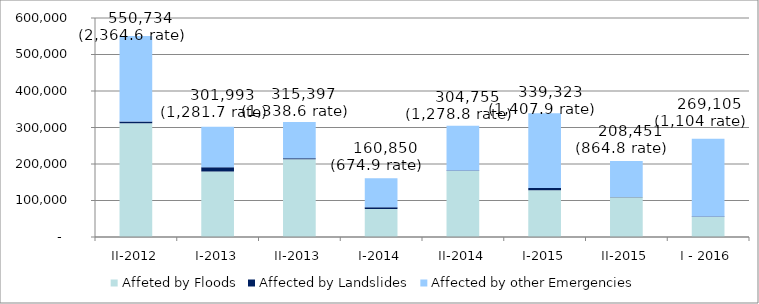
| Category | Affeted by Floods | Affected by Landslides | Affected by other Emergencies  |
|---|---|---|---|
| II-2012 | 311337 | 5039 | 234358 |
| I-2013 | 179302 | 11819 | 110872 |
| II-2013 | 212849 | 2866 | 99682 |
| I-2014 | 76809 | 4833 | 79208 |
| II-2014 | 180748 | 1158 | 122849 |
| I-2015 | 128256 | 6155 | 204912 |
| II-2015 | 109114 | 675 | 98662 |
| I - 2016 | 54600 | 1320 | 213185 |